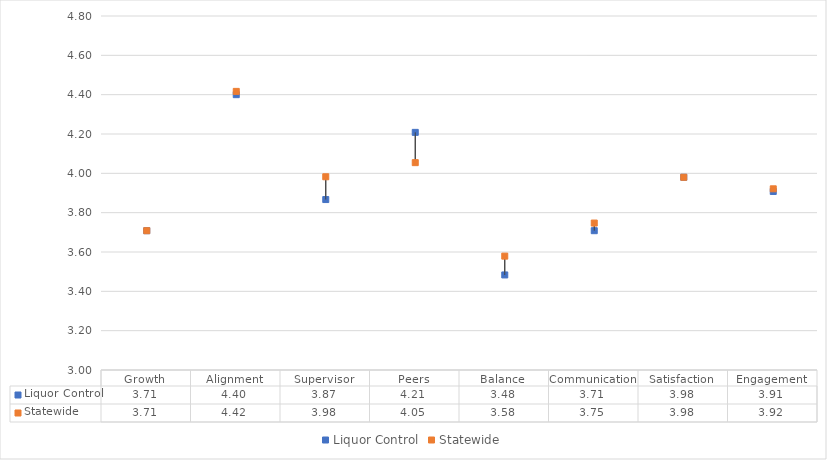
| Category | Liquor Control | Statewide |
|---|---|---|
| Growth | 3.708 | 3.708 |
| Alignment | 4.4 | 4.417 |
| Supervisor | 3.867 | 3.983 |
| Peers | 4.208 | 4.054 |
| Balance | 3.483 | 3.579 |
| Communication | 3.708 | 3.747 |
| Satisfaction | 3.98 | 3.98 |
| Engagement | 3.908 | 3.921 |